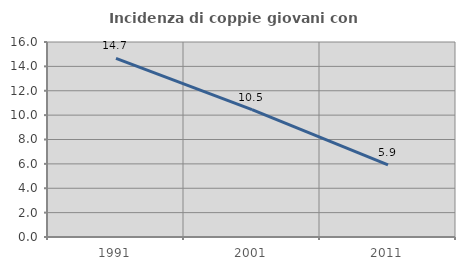
| Category | Incidenza di coppie giovani con figli |
|---|---|
| 1991.0 | 14.664 |
| 2001.0 | 10.453 |
| 2011.0 | 5.921 |